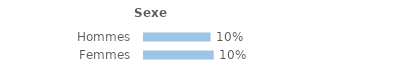
| Category | Series 0 |
|---|---|
| Hommes | 0.099 |
| Femmes | 0.104 |